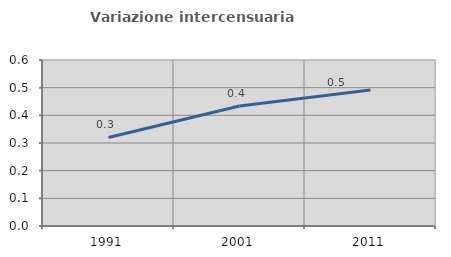
| Category | Variazione intercensuaria annua |
|---|---|
| 1991.0 | 0.32 |
| 2001.0 | 0.434 |
| 2011.0 | 0.492 |